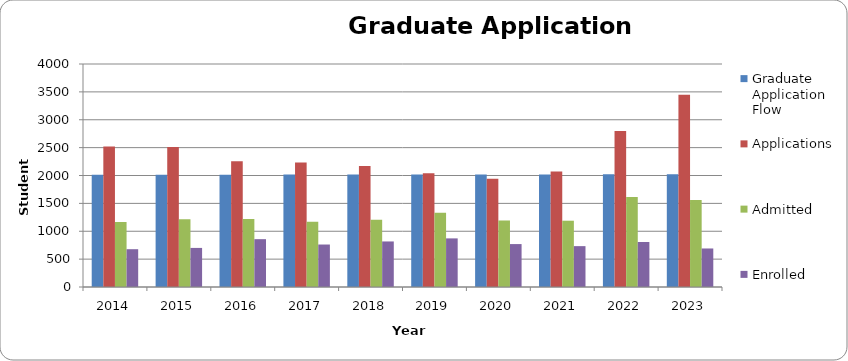
| Category | Graduate Application Flow | Applications | Admitted | Enrolled |
|---|---|---|---|---|
| 2014.0 | 2012 | 2518 | 1167 | 678 |
| 2015.0 | 2014 | 2509 | 1214 | 701 |
| 2016.0 | 2015 | 2255 | 1218 | 858 |
| 2017.0 | 2016 | 2233 | 1169 | 762 |
| 2018.0 | 2017 | 2172 | 1207 | 817 |
| 2019.0 | 2018 | 2040 | 1333 | 872 |
| 2020.0 | 2019 | 1942 | 1193 | 770 |
| 2021.0 | 2020 | 2073 | 1189 | 733 |
| 2022.0 | 2021 | 2799 | 1616 | 807 |
| 2023.0 | 2022 | 3450 | 1560 | 691 |